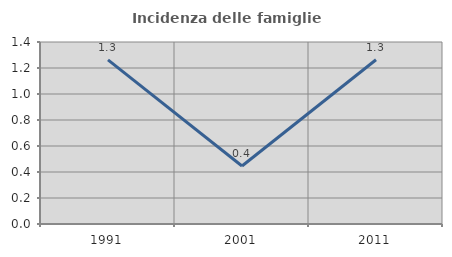
| Category | Incidenza delle famiglie numerose |
|---|---|
| 1991.0 | 1.263 |
| 2001.0 | 0.446 |
| 2011.0 | 1.264 |